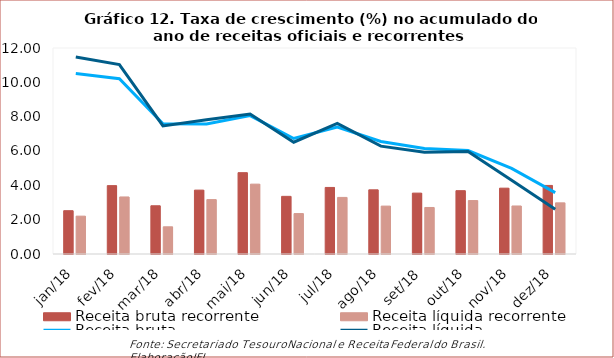
| Category | Receita bruta recorrente | Receita líquida recorrente |
|---|---|---|
| jan/18 | 2.523 | 2.205 |
| fev/18 | 3.983 | 3.322 |
| mar/18 | 2.81 | 1.585 |
| abr/18 | 3.722 | 3.169 |
| mai/18 | 4.737 | 4.07 |
| jun/18 | 3.358 | 2.355 |
| jul/18 | 3.877 | 3.296 |
| ago/18 | 3.738 | 2.791 |
| set/18 | 3.546 | 2.71 |
| out/18 | 3.689 | 3.113 |
| nov/18 | 3.835 | 2.797 |
| dez/18 | 3.994 | 2.98 |